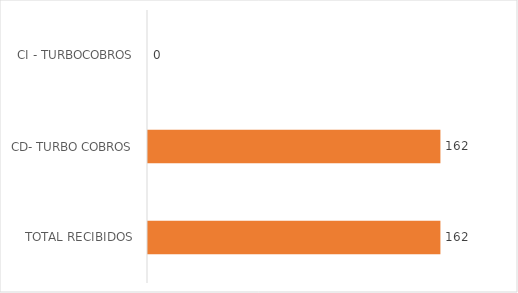
| Category | Series 0 |
|---|---|
| TOTAL RECIBIDOS | 162 |
| CD- TURBO COBROS | 162 |
| CI - TURBOCOBROS | 0 |